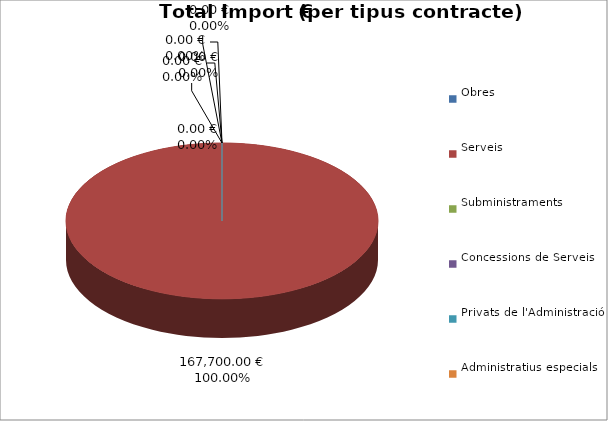
| Category | Total preu
(amb IVA) |
|---|---|
| Obres | 0 |
| Serveis | 167700 |
| Subministraments | 0 |
| Concessions de Serveis | 0 |
| Privats de l'Administració | 0 |
| Administratius especials | 0 |